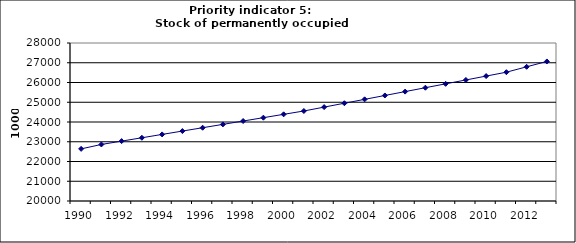
| Category | Stock of permanently occupied dwellings, 1000 |
|---|---|
| 1990 | 22639.315 |
| 1991 | 22862.734 |
| 1992 | 23032.211 |
| 1993 | 23201.689 |
| 1994 | 23371.166 |
| 1995 | 23540.644 |
| 1996 | 23710.121 |
| 1997 | 23879.598 |
| 1998 | 24049.076 |
| 1999 | 24218.553 |
| 2000 | 24388.031 |
| 2001 | 24557.508 |
| 2002 | 24753.895 |
| 2003 | 24950.283 |
| 2004 | 25146.67 |
| 2005 | 25343.057 |
| 2006 | 25539.444 |
| 2007 | 25735.832 |
| 2008 | 25932.219 |
| 2009 | 26128.606 |
| 2010 | 26324.994 |
| 2011 | 26521.381 |
| 2012 | 26794.432 |
| 2013 | 27065.336 |